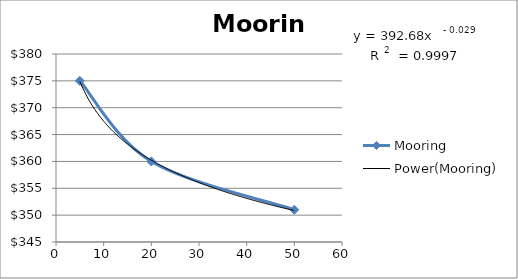
| Category | Mooring |
|---|---|
| 5.0 | 375 |
| 20.0 | 360 |
| 50.0 | 351 |